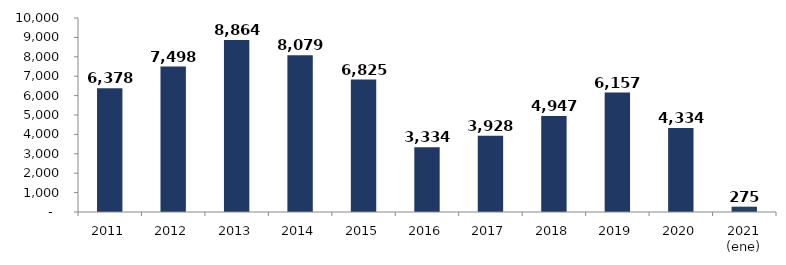
| Category | Series 0 |
|---|---|
| 2011 | 6377.615 |
| 2012 | 7498.207 |
| 2013 | 8863.622 |
| 2014 | 8079.21 |
| 2015 | 6824.624 |
| 2016 | 3333.564 |
| 2017 | 3928.017 |
| 2018 | 4947.435 |
| 2019 | 6157.132 |
| 2020 | 4333.656 |
| 2021 (ene) | 274.905 |